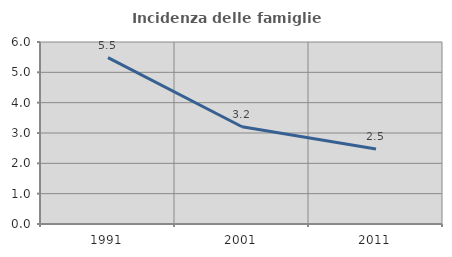
| Category | Incidenza delle famiglie numerose |
|---|---|
| 1991.0 | 5.482 |
| 2001.0 | 3.207 |
| 2011.0 | 2.472 |